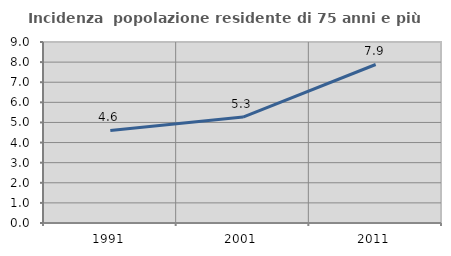
| Category | Incidenza  popolazione residente di 75 anni e più |
|---|---|
| 1991.0 | 4.605 |
| 2001.0 | 5.267 |
| 2011.0 | 7.882 |